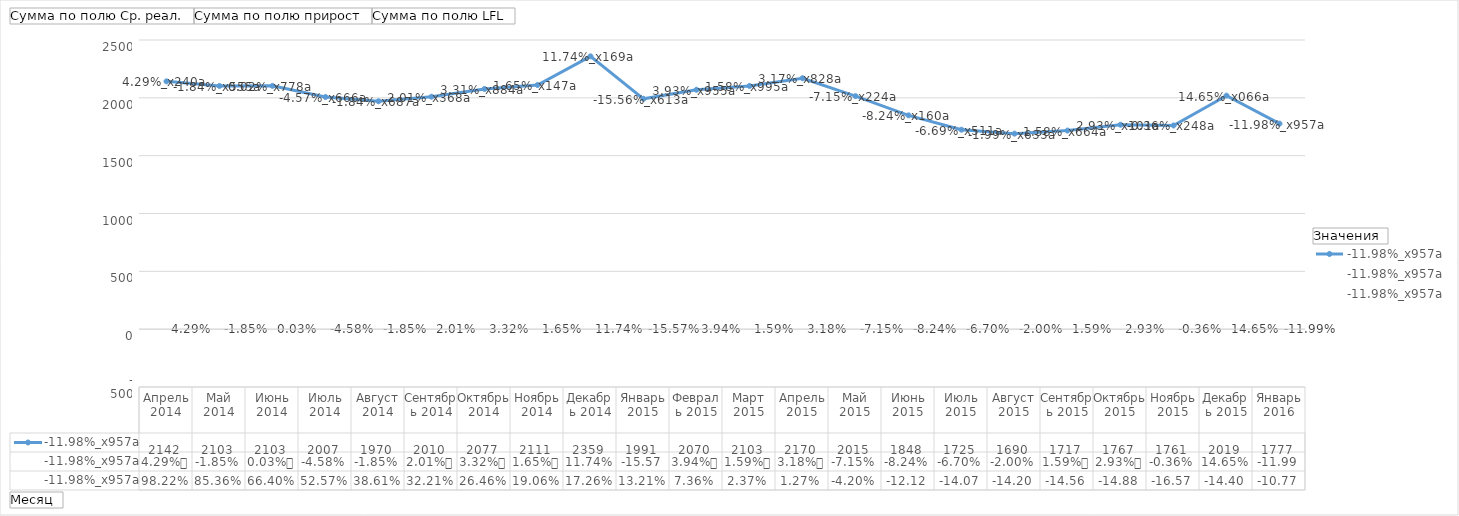
| Category | Сумма по полю Ср. реал. | Сумма по полю прирост | Сумма по полю LFL |
|---|---|---|---|
| Апрель 2014 | 2142.422 | 0.043 | 0.982 |
| Май 2014 | 2102.883 | -0.018 | 0.854 |
| Июнь 2014 | 2103.467 | 0 | 0.664 |
| Июль 2014 | 2007.198 | -0.046 | 0.526 |
| Август 2014 | 1970.128 | -0.018 | 0.386 |
| Сентябрь 2014 | 2009.8 | 0.02 | 0.322 |
| Октябрь 2014 | 2076.502 | 0.033 | 0.265 |
| Ноябрь 2014 | 2110.795 | 0.017 | 0.191 |
| Декабрь 2014 | 2358.638 | 0.117 | 0.173 |
| Январь 2015 | 1991.489 | -0.156 | 0.132 |
| Февраль 2015 | 2069.945 | 0.039 | 0.074 |
| Март 2015 | 2102.856 | 0.016 | 0.024 |
| Апрель 2015 | 2169.691 | 0.032 | 0.013 |
| Май 2015 | 2014.509 | -0.072 | -0.042 |
| Июнь 2015 | 1848.482 | -0.082 | -0.121 |
| Июль 2015 | 1724.724 | -0.067 | -0.141 |
| Август 2015 | 1690.293 | -0.02 | -0.142 |
| Сентябрь 2015 | 1717.111 | 0.016 | -0.146 |
| Октябрь 2015 | 1767.44 | 0.029 | -0.149 |
| Ноябрь 2015 | 1761.033 | -0.004 | -0.166 |
| Декабрь 2015 | 2019.036 | 0.147 | -0.144 |
| Январь 2016 | 1776.963 | -0.12 | -0.108 |